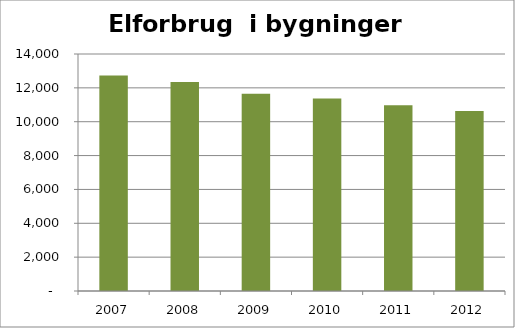
| Category | Elforbrug MWh |
|---|---|
| 2007.0 | 12730.324 |
| 2008.0 | 12343.802 |
| 2009.0 | 11652.47 |
| 2010.0 | 11370.156 |
| 2011.0 | 10967.47 |
| 2012.0 | 10627.79 |